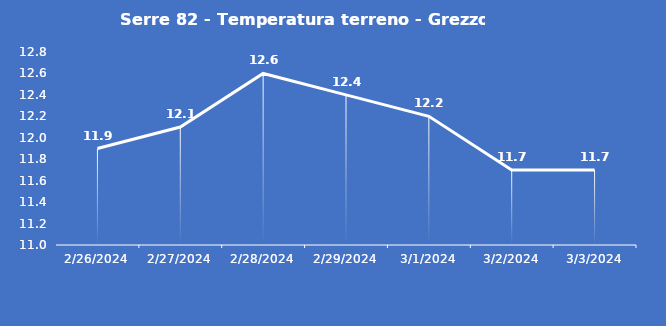
| Category | Serre 82 - Temperatura terreno - Grezzo (°C) |
|---|---|
| 2/26/24 | 11.9 |
| 2/27/24 | 12.1 |
| 2/28/24 | 12.6 |
| 2/29/24 | 12.4 |
| 3/1/24 | 12.2 |
| 3/2/24 | 11.7 |
| 3/3/24 | 11.7 |